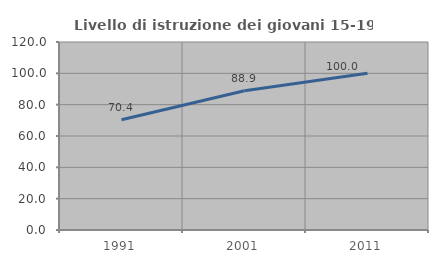
| Category | Livello di istruzione dei giovani 15-19 anni |
|---|---|
| 1991.0 | 70.37 |
| 2001.0 | 88.889 |
| 2011.0 | 100 |